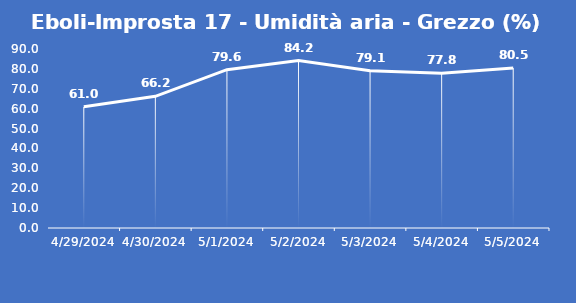
| Category | Eboli-Improsta 17 - Umidità aria - Grezzo (%) |
|---|---|
| 4/29/24 | 61 |
| 4/30/24 | 66.2 |
| 5/1/24 | 79.6 |
| 5/2/24 | 84.2 |
| 5/3/24 | 79.1 |
| 5/4/24 | 77.8 |
| 5/5/24 | 80.5 |